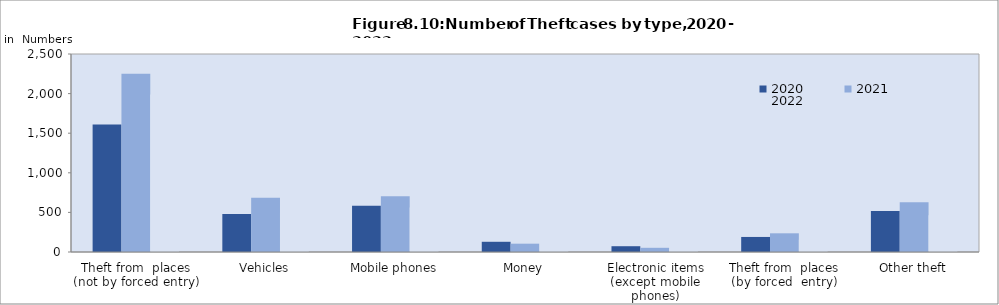
| Category | 2020  | 2021  | 2022  |
|---|---|---|---|
| Theft from  places (not by forced entry) | 1609 | 2251 | 1989 |
| Vehicles | 479 | 685 | 493 |
| Mobile phones | 583 | 705 | 561 |
| Money | 129 | 105 | 276 |
| Electronic items (except mobile phones) | 73 | 53 | 43 |
| Theft from  places (by forced  entry) | 190 | 236 | 156 |
| Other theft | 518 | 627 | 464 |